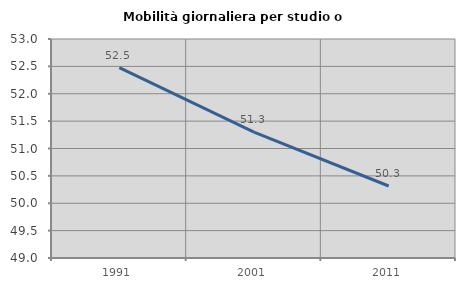
| Category | Mobilità giornaliera per studio o lavoro |
|---|---|
| 1991.0 | 52.476 |
| 2001.0 | 51.298 |
| 2011.0 | 50.315 |